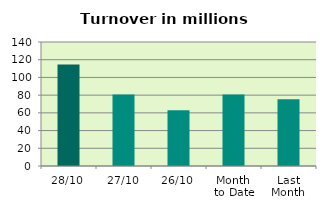
| Category | Series 0 |
|---|---|
| 28/10 | 114.525 |
| 27/10 | 80.752 |
| 26/10 | 63.054 |
| Month 
to Date | 80.652 |
| Last
Month | 75.235 |